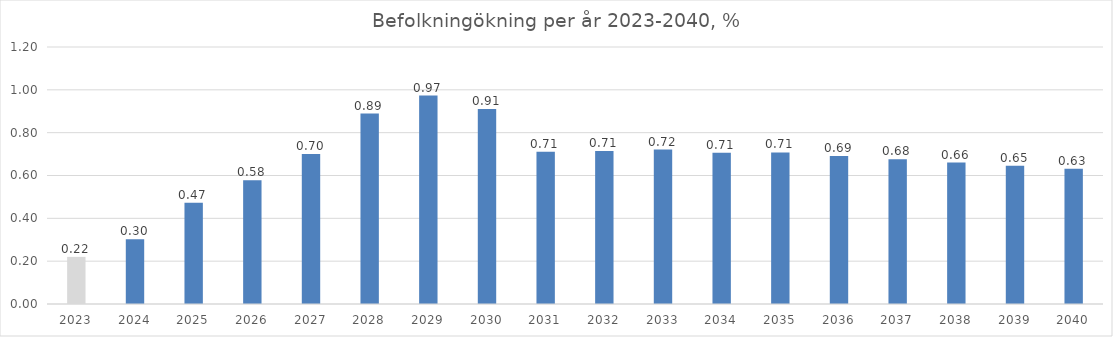
| Category | Series 0 |
|---|---|
| 2023.0 | 0.22 |
| 2024.0 | 0.302 |
| 2025.0 | 0.473 |
| 2026.0 | 0.578 |
| 2027.0 | 0.7 |
| 2028.0 | 0.889 |
| 2029.0 | 0.973 |
| 2030.0 | 0.911 |
| 2031.0 | 0.71 |
| 2032.0 | 0.715 |
| 2033.0 | 0.721 |
| 2034.0 | 0.706 |
| 2035.0 | 0.707 |
| 2036.0 | 0.691 |
| 2037.0 | 0.676 |
| 2038.0 | 0.66 |
| 2039.0 | 0.645 |
| 2040.0 | 0.631 |